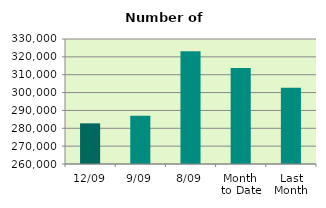
| Category | Series 0 |
|---|---|
| 12/09 | 282764 |
| 9/09 | 287020 |
| 8/09 | 323076 |
| Month 
to Date | 313786.25 |
| Last
Month | 302693.565 |